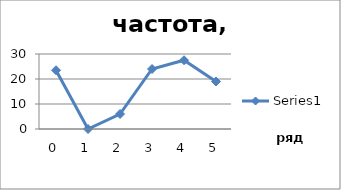
| Category | Series 0 |
|---|---|
| 0.0 | 23.5 |
| 1.0 | 0 |
| 2.0 | 6 |
| 3.0 | 24 |
| 4.0 | 27.5 |
| 5.0 | 19 |